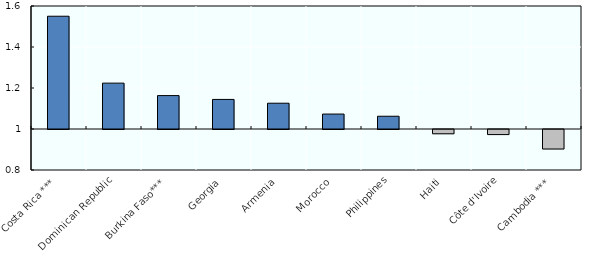
| Category | Series 0 |
|---|---|
| Costa Rica *** | 1.55 |
| Dominican Republic | 1.224 |
| Burkina Faso*** | 1.163 |
| Georgia | 1.144 |
| Armenia | 1.126 |
| Morocco | 1.073 |
| Philippines | 1.062 |
| Haiti | 0.979 |
| Côte d'Ivoire | 0.975 |
| Cambodia *** | 0.905 |